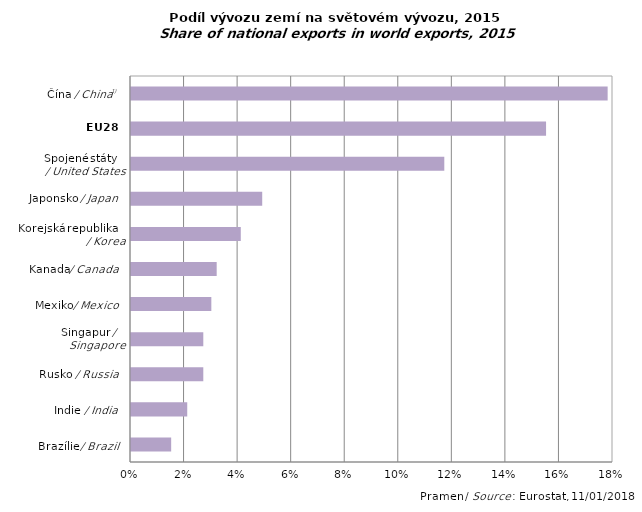
| Category | Series 0 |
|---|---|
|  | 0.015 |
|  | 0.021 |
|  | 0.027 |
|  | 0.027 |
|  | 0.03 |
|  | 0.032 |
|  | 0.041 |
|  | 0.049 |
|  | 0.117 |
|  | 0.155 |
|  | 0.178 |